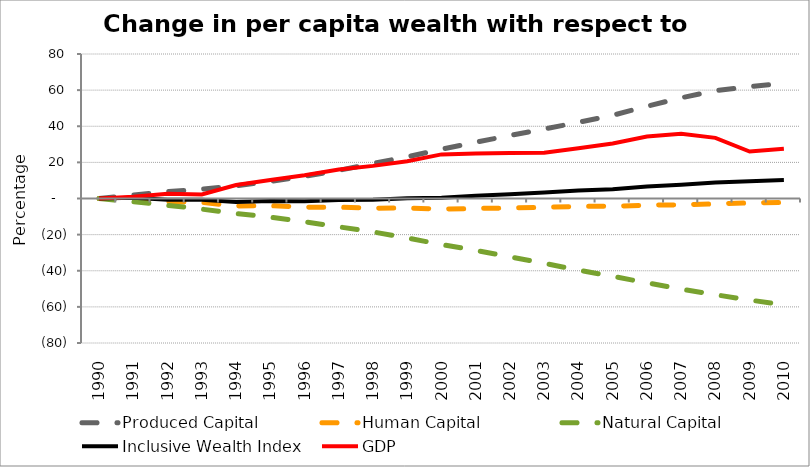
| Category | Produced Capital  | Human Capital | Natural Capital | Inclusive Wealth Index | GDP |
|---|---|---|---|---|---|
| 1990.0 | 0 | 0 | 0 | 0 | 0 |
| 1991.0 | 1.979 | -0.022 | -1.774 | 0.351 | 1.025 |
| 1992.0 | 3.789 | -1.817 | -3.752 | -0.714 | 2.682 |
| 1993.0 | 5.214 | -2.126 | -5.893 | -0.705 | 2.208 |
| 1994.0 | 7.028 | -4.136 | -8.301 | -1.946 | 7.427 |
| 1995.0 | 9.493 | -3.933 | -10.347 | -1.326 | 10.27 |
| 1996.0 | 12.228 | -4.833 | -12.848 | -1.518 | 12.924 |
| 1997.0 | 15.57 | -4.767 | -15.687 | -0.841 | 16.042 |
| 1998.0 | 19.417 | -5.444 | -18.496 | -0.639 | 18.055 |
| 1999.0 | 23.087 | -5.245 | -21.829 | 0.199 | 20.604 |
| 2000.0 | 27.259 | -5.931 | -25.499 | 0.443 | 24.415 |
| 2001.0 | 31.149 | -5.511 | -28.748 | 1.499 | 24.905 |
| 2002.0 | 34.906 | -5.254 | -32.331 | 2.395 | 25.149 |
| 2003.0 | 38.476 | -4.908 | -35.879 | 3.323 | 25.303 |
| 2004.0 | 42.189 | -4.337 | -39.66 | 4.45 | 27.806 |
| 2005.0 | 46.076 | -4.349 | -43.094 | 5.165 | 30.468 |
| 2006.0 | 51.07 | -3.637 | -46.679 | 6.666 | 34.322 |
| 2007.0 | 55.747 | -3.51 | -50.174 | 7.65 | 35.788 |
| 2008.0 | 59.746 | -2.997 | -53.279 | 8.803 | 33.577 |
| 2009.0 | 61.969 | -2.458 | -56.212 | 9.618 | 25.986 |
| 2010.0 | 63.817 | -2.138 | -58.859 | 10.193 | 27.602 |